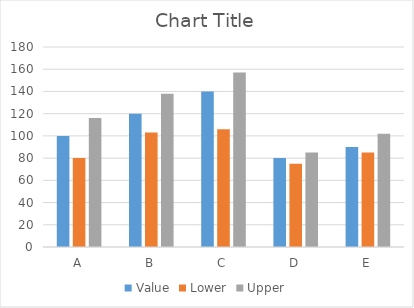
| Category | Value | Lower | Upper |
|---|---|---|---|
| A | 100 | 80 | 116 |
| B | 120 | 103 | 138 |
| C | 140 | 106 | 157 |
| D | 80 | 75 | 85 |
| E | 90 | 85 | 102 |